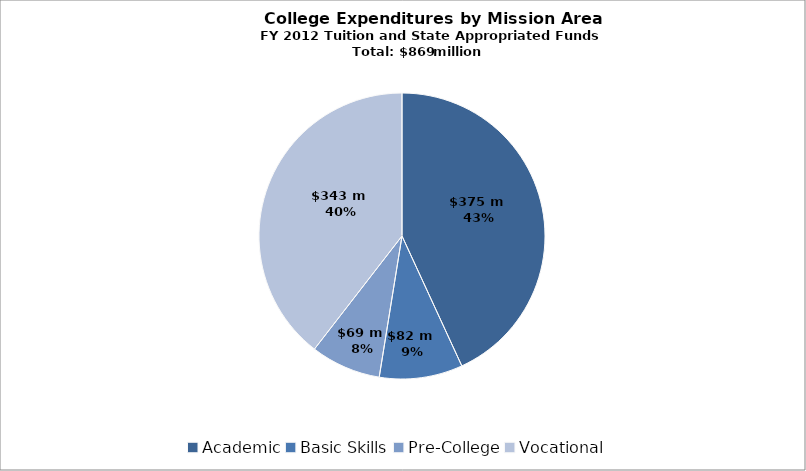
| Category | Series 0 |
|---|---|
| Academic | 374897832.977 |
| Basic Skills | 81871295.476 |
| Pre-College | 68978913.531 |
| Vocational | 343480850.016 |